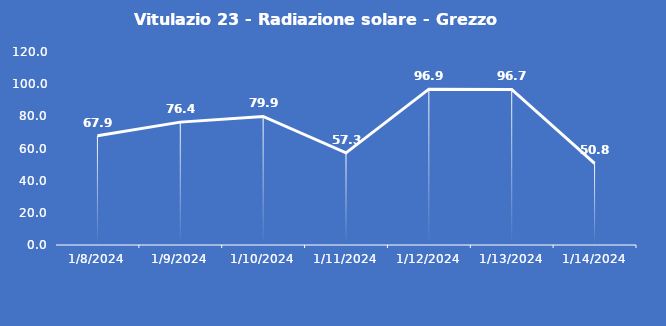
| Category | Vitulazio 23 - Radiazione solare - Grezzo (W/m2) |
|---|---|
| 1/8/24 | 67.9 |
| 1/9/24 | 76.4 |
| 1/10/24 | 79.9 |
| 1/11/24 | 57.3 |
| 1/12/24 | 96.9 |
| 1/13/24 | 96.7 |
| 1/14/24 | 50.8 |